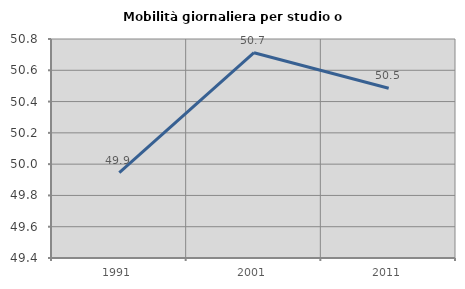
| Category | Mobilità giornaliera per studio o lavoro |
|---|---|
| 1991.0 | 49.945 |
| 2001.0 | 50.712 |
| 2011.0 | 50.485 |